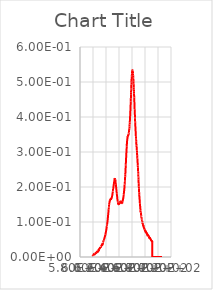
| Category | Series 0 |
|---|---|
| 599.2322998 | 0.005 |
| 599.3508301 | 0.005 |
| 599.4693604 | 0.006 |
| 599.5878906 | 0.005 |
| 599.7064209 | 0.006 |
| 599.8248901 | 0.005 |
| 599.9434204 | 0.006 |
| 600.0619507 | 0.005 |
| 600.180481 | 0.006 |
| 600.2990112 | 0.006 |
| 600.4175415 | 0.006 |
| 600.5361328 | 0.006 |
| 600.6546631 | 0.007 |
| 600.7731934 | 0.006 |
| 600.8917236 | 0.007 |
| 601.0102539 | 0.007 |
| 601.1288452 | 0.008 |
| 601.2473755 | 0.006 |
| 601.3659058 | 0.008 |
| 601.4844971 | 0.007 |
| 601.6030273 | 0.009 |
| 601.7215576 | 0.007 |
| 601.8401489 | 0.008 |
| 601.9586792 | 0.008 |
| 602.0772705 | 0.009 |
| 602.1958008 | 0.008 |
| 602.3143921 | 0.009 |
| 602.4329834 | 0.008 |
| 602.5515137 | 0.007 |
| 602.670105 | 0.008 |
| 602.7886963 | 0.01 |
| 602.9072876 | 0.009 |
| 603.0258179 | 0.01 |
| 603.1444092 | 0.009 |
| 603.2630005 | 0.01 |
| 603.3815918 | 0.009 |
| 603.5001831 | 0.01 |
| 603.6187744 | 0.01 |
| 603.7373657 | 0.01 |
| 603.855957 | 0.01 |
| 603.9745483 | 0.011 |
| 604.0931396 | 0.011 |
| 604.211731 | 0.011 |
| 604.3303833 | 0.01 |
| 604.4489746 | 0.012 |
| 604.5675659 | 0.011 |
| 604.6861572 | 0.012 |
| 604.8048096 | 0.012 |
| 604.9234009 | 0.013 |
| 605.0419922 | 0.012 |
| 605.1606445 | 0.013 |
| 605.2792358 | 0.012 |
| 605.3978882 | 0.013 |
| 605.5164795 | 0.013 |
| 605.6351318 | 0.014 |
| 605.7537231 | 0.013 |
| 605.8723755 | 0.015 |
| 605.9910278 | 0.014 |
| 606.1096191 | 0.015 |
| 606.2282715 | 0.014 |
| 606.3469238 | 0.015 |
| 606.4655762 | 0.015 |
| 606.5841675 | 0.015 |
| 606.7028198 | 0.015 |
| 606.8214722 | 0.016 |
| 606.9401245 | 0.016 |
| 607.0587769 | 0.017 |
| 607.1774292 | 0.013 |
| 607.2960815 | 0.018 |
| 607.4147339 | 0.017 |
| 607.5333862 | 0.017 |
| 607.6520386 | 0.017 |
| 607.7706909 | 0.018 |
| 607.8893433 | 0.018 |
| 608.0080566 | 0.019 |
| 608.126709 | 0.018 |
| 608.2453613 | 0.02 |
| 608.3640137 | 0.019 |
| 608.4827271 | 0.02 |
| 608.6013794 | 0.019 |
| 608.7200317 | 0.02 |
| 608.8387451 | 0.018 |
| 608.9573975 | 0.019 |
| 609.0761108 | 0.019 |
| 609.1947632 | 0.02 |
| 609.3134766 | 0.022 |
| 609.4321289 | 0.022 |
| 609.5508423 | 0.024 |
| 609.6695557 | 0.023 |
| 609.788208 | 0.024 |
| 609.9069214 | 0.023 |
| 610.0256348 | 0.024 |
| 610.1443481 | 0.024 |
| 610.2630005 | 0.025 |
| 610.3817139 | 0.025 |
| 610.5004272 | 0.026 |
| 610.6191406 | 0.025 |
| 610.737854 | 0.026 |
| 610.8565674 | 0.026 |
| 610.9752808 | 0.027 |
| 611.0939941 | 0.027 |
| 611.2127075 | 0.028 |
| 611.3314209 | 0.027 |
| 611.4501343 | 0.029 |
| 611.5688477 | 0.028 |
| 611.687561 | 0.029 |
| 611.8063354 | 0.029 |
| 611.9250488 | 0.03 |
| 612.0437622 | 0.03 |
| 612.1624756 | 0.029 |
| 612.28125 | 0.029 |
| 612.3999634 | 0.031 |
| 612.5187378 | 0.031 |
| 612.6374512 | 0.031 |
| 612.7561646 | 0.031 |
| 612.874939 | 0.032 |
| 612.9936523 | 0.032 |
| 613.1124268 | 0.033 |
| 613.2312012 | 0.032 |
| 613.3499146 | 0.033 |
| 613.468689 | 0.033 |
| 613.5874023 | 0.034 |
| 613.7061768 | 0.034 |
| 613.8249512 | 0.034 |
| 613.9437256 | 0.035 |
| 614.062439 | 0.036 |
| 614.1812134 | 0.036 |
| 614.2999878 | 0.037 |
| 614.4187622 | 0.034 |
| 614.5375366 | 0.038 |
| 614.656311 | 0.038 |
| 614.7750854 | 0.039 |
| 614.8938599 | 0.038 |
| 615.0126343 | 0.04 |
| 615.1314087 | 0.04 |
| 615.2501831 | 0.041 |
| 615.3689575 | 0.041 |
| 615.4877319 | 0.043 |
| 615.6065063 | 0.042 |
| 615.7253418 | 0.043 |
| 615.8441162 | 0.043 |
| 615.9628906 | 0.045 |
| 616.081665 | 0.045 |
| 616.2005005 | 0.046 |
| 616.3192749 | 0.046 |
| 616.4380493 | 0.047 |
| 616.5568848 | 0.047 |
| 616.6756592 | 0.048 |
| 616.7944946 | 0.047 |
| 616.913269 | 0.05 |
| 617.0321045 | 0.05 |
| 617.1508789 | 0.052 |
| 617.2697144 | 0.052 |
| 617.3885498 | 0.053 |
| 617.5073242 | 0.053 |
| 617.6261597 | 0.054 |
| 617.7449951 | 0.054 |
| 617.8637695 | 0.056 |
| 617.982605 | 0.056 |
| 618.1014404 | 0.057 |
| 618.2202759 | 0.057 |
| 618.3391113 | 0.059 |
| 618.4579468 | 0.059 |
| 618.5767212 | 0.061 |
| 618.6955566 | 0.061 |
| 618.8143921 | 0.063 |
| 618.9332275 | 0.062 |
| 619.052063 | 0.064 |
| 619.1708984 | 0.065 |
| 619.2897339 | 0.066 |
| 619.4086304 | 0.067 |
| 619.5274658 | 0.068 |
| 619.6463013 | 0.069 |
| 619.7651367 | 0.07 |
| 619.8839722 | 0.071 |
| 620.0028687 | 0.074 |
| 620.1217041 | 0.074 |
| 620.2405396 | 0.076 |
| 620.359436 | 0.076 |
| 620.4782715 | 0.078 |
| 620.5971069 | 0.079 |
| 620.7160034 | 0.081 |
| 620.8348389 | 0.081 |
| 620.9537354 | 0.084 |
| 621.0725708 | 0.085 |
| 621.1914673 | 0.087 |
| 621.3103027 | 0.087 |
| 621.4291992 | 0.091 |
| 621.5480347 | 0.091 |
| 621.6669312 | 0.094 |
| 621.7858276 | 0.094 |
| 621.9047241 | 0.096 |
| 622.0235596 | 0.097 |
| 622.1424561 | 0.1 |
| 622.2613525 | 0.102 |
| 622.380249 | 0.104 |
| 622.4990845 | 0.105 |
| 622.617981 | 0.109 |
| 622.7368774 | 0.11 |
| 622.8557739 | 0.112 |
| 622.9746704 | 0.114 |
| 623.0935669 | 0.117 |
| 623.2124634 | 0.118 |
| 623.3313599 | 0.121 |
| 623.4502563 | 0.123 |
| 623.5691528 | 0.126 |
| 623.6880493 | 0.127 |
| 623.8070068 | 0.131 |
| 623.9259033 | 0.133 |
| 624.0447998 | 0.136 |
| 624.1636963 | 0.136 |
| 624.2825928 | 0.141 |
| 624.4015503 | 0.142 |
| 624.5204468 | 0.145 |
| 624.6393433 | 0.146 |
| 624.7583008 | 0.149 |
| 624.8771973 | 0.15 |
| 624.9960938 | 0.152 |
| 625.1150513 | 0.153 |
| 625.2339478 | 0.155 |
| 625.3529053 | 0.156 |
| 625.4718018 | 0.157 |
| 625.5907593 | 0.158 |
| 625.7097168 | 0.161 |
| 625.8286133 | 0.16 |
| 625.9475708 | 0.161 |
| 626.0664673 | 0.162 |
| 626.1854248 | 0.163 |
| 626.3043823 | 0.162 |
| 626.4233398 | 0.164 |
| 626.5422363 | 0.163 |
| 626.6611938 | 0.164 |
| 626.7801514 | 0.165 |
| 626.8991089 | 0.166 |
| 627.0180664 | 0.165 |
| 627.1370239 | 0.166 |
| 627.2559204 | 0.165 |
| 627.3748779 | 0.166 |
| 627.4938354 | 0.165 |
| 627.612793 | 0.167 |
| 627.7317505 | 0.163 |
| 627.850708 | 0.167 |
| 627.9697266 | 0.166 |
| 628.0886841 | 0.167 |
| 628.2076416 | 0.167 |
| 628.3265991 | 0.168 |
| 628.4455566 | 0.168 |
| 628.5645142 | 0.169 |
| 628.6835327 | 0.169 |
| 628.8024902 | 0.17 |
| 628.9214478 | 0.17 |
| 629.0404053 | 0.171 |
| 629.1594238 | 0.172 |
| 629.2783813 | 0.173 |
| 629.3973389 | 0.174 |
| 629.5163574 | 0.176 |
| 629.6353149 | 0.176 |
| 629.7543335 | 0.178 |
| 629.873291 | 0.179 |
| 629.9923096 | 0.181 |
| 630.1112671 | 0.182 |
| 630.2302856 | 0.184 |
| 630.3492432 | 0.185 |
| 630.4682617 | 0.187 |
| 630.5872803 | 0.188 |
| 630.7062378 | 0.19 |
| 630.8252563 | 0.19 |
| 630.9442749 | 0.194 |
| 631.0632324 | 0.195 |
| 631.182251 | 0.197 |
| 631.3012695 | 0.198 |
| 631.4202881 | 0.199 |
| 631.5393066 | 0.201 |
| 631.6583252 | 0.204 |
| 631.7772827 | 0.204 |
| 631.8963013 | 0.206 |
| 632.0153198 | 0.208 |
| 632.1343384 | 0.209 |
| 632.2533569 | 0.211 |
| 632.3723755 | 0.213 |
| 632.491394 | 0.214 |
| 632.6104126 | 0.216 |
| 632.7294312 | 0.216 |
| 632.8485107 | 0.218 |
| 632.9675293 | 0.219 |
| 633.0865479 | 0.222 |
| 633.2055664 | 0.223 |
| 633.324585 | 0.224 |
| 633.4436035 | 0.223 |
| 633.5626831 | 0.224 |
| 633.6817017 | 0.223 |
| 633.8007202 | 0.223 |
| 633.9197998 | 0.223 |
| 634.0388184 | 0.222 |
| 634.1578369 | 0.22 |
| 634.2769165 | 0.221 |
| 634.3959351 | 0.219 |
| 634.5150146 | 0.219 |
| 634.6340332 | 0.216 |
| 634.7531128 | 0.215 |
| 634.8721313 | 0.213 |
| 634.9912109 | 0.212 |
| 635.1102295 | 0.208 |
| 635.2293091 | 0.206 |
| 635.3483276 | 0.204 |
| 635.4674072 | 0.203 |
| 635.5864868 | 0.199 |
| 635.7055054 | 0.198 |
| 635.824585 | 0.195 |
| 635.9436646 | 0.193 |
| 636.0627441 | 0.191 |
| 636.1817627 | 0.189 |
| 636.3008423 | 0.186 |
| 636.4199219 | 0.184 |
| 636.5390015 | 0.181 |
| 636.6580811 | 0.18 |
| 636.7771606 | 0.178 |
| 636.8961792 | 0.176 |
| 637.0152588 | 0.174 |
| 637.1343384 | 0.173 |
| 637.253418 | 0.17 |
| 637.3724976 | 0.169 |
| 637.4915771 | 0.166 |
| 637.6106567 | 0.165 |
| 637.7297974 | 0.162 |
| 637.848877 | 0.162 |
| 637.9679565 | 0.159 |
| 638.0870361 | 0.159 |
| 638.2061157 | 0.157 |
| 638.3251953 | 0.156 |
| 638.4442749 | 0.154 |
| 638.5634155 | 0.154 |
| 638.6824951 | 0.153 |
| 638.8015747 | 0.154 |
| 638.9207153 | 0.152 |
| 639.0397949 | 0.152 |
| 639.1588745 | 0.151 |
| 639.2780151 | 0.152 |
| 639.3970947 | 0.15 |
| 639.5161743 | 0.151 |
| 639.6353149 | 0.152 |
| 639.7543945 | 0.152 |
| 639.8735352 | 0.153 |
| 639.9926147 | 0.153 |
| 640.1117554 | 0.154 |
| 640.230835 | 0.153 |
| 640.3499756 | 0.152 |
| 640.4691162 | 0.152 |
| 640.5881958 | 0.154 |
| 640.7073364 | 0.153 |
| 640.8264771 | 0.154 |
| 640.9455566 | 0.154 |
| 641.0646973 | 0.155 |
| 641.1838379 | 0.155 |
| 641.3029175 | 0.156 |
| 641.4220581 | 0.157 |
| 641.5411987 | 0.158 |
| 641.6603394 | 0.157 |
| 641.77948 | 0.158 |
| 641.8985596 | 0.157 |
| 642.0177002 | 0.158 |
| 642.1368408 | 0.158 |
| 642.2559814 | 0.158 |
| 642.3751221 | 0.158 |
| 642.4942627 | 0.159 |
| 642.6134033 | 0.158 |
| 642.7325439 | 0.158 |
| 642.8516846 | 0.157 |
| 642.9708252 | 0.158 |
| 643.0899658 | 0.157 |
| 643.2091064 | 0.157 |
| 643.3282471 | 0.157 |
| 643.4474487 | 0.157 |
| 643.5665894 | 0.156 |
| 643.68573 | 0.156 |
| 643.8048706 | 0.155 |
| 643.9240112 | 0.156 |
| 644.0432129 | 0.155 |
| 644.1623535 | 0.157 |
| 644.2814941 | 0.156 |
| 644.4006348 | 0.156 |
| 644.5198364 | 0.154 |
| 644.6389771 | 0.155 |
| 644.7581177 | 0.154 |
| 644.8773193 | 0.154 |
| 644.99646 | 0.153 |
| 645.1156616 | 0.156 |
| 645.2348022 | 0.156 |
| 645.3540039 | 0.159 |
| 645.4731445 | 0.159 |
| 645.5923462 | 0.161 |
| 645.7114868 | 0.161 |
| 645.8306885 | 0.163 |
| 645.9498291 | 0.162 |
| 646.0690308 | 0.164 |
| 646.1881714 | 0.164 |
| 646.307373 | 0.166 |
| 646.4265747 | 0.166 |
| 646.5457153 | 0.169 |
| 646.664917 | 0.169 |
| 646.7841187 | 0.171 |
| 646.9033203 | 0.172 |
| 647.0224609 | 0.174 |
| 647.1416626 | 0.176 |
| 647.2608643 | 0.179 |
| 647.3800659 | 0.18 |
| 647.4992065 | 0.182 |
| 647.6184082 | 0.184 |
| 647.7376099 | 0.187 |
| 647.8568115 | 0.188 |
| 647.9760132 | 0.191 |
| 648.0952148 | 0.193 |
| 648.2144165 | 0.196 |
| 648.3336182 | 0.197 |
| 648.4528198 | 0.201 |
| 648.5720215 | 0.203 |
| 648.6912231 | 0.207 |
| 648.8104248 | 0.209 |
| 648.9296265 | 0.213 |
| 649.0488281 | 0.215 |
| 649.1680298 | 0.219 |
| 649.2872314 | 0.223 |
| 649.4064331 | 0.227 |
| 649.5256958 | 0.23 |
| 649.6448975 | 0.235 |
| 649.7640991 | 0.238 |
| 649.8833008 | 0.242 |
| 650.0025024 | 0.246 |
| 650.1217651 | 0.252 |
| 650.2409668 | 0.256 |
| 650.3601685 | 0.262 |
| 650.4794312 | 0.265 |
| 650.5986328 | 0.27 |
| 650.7178345 | 0.274 |
| 650.8370972 | 0.279 |
| 650.9562988 | 0.283 |
| 651.0755615 | 0.289 |
| 651.1947632 | 0.292 |
| 651.3139648 | 0.296 |
| 651.4332275 | 0.3 |
| 651.5524292 | 0.304 |
| 651.6716919 | 0.307 |
| 651.7908936 | 0.312 |
| 651.9101563 | 0.315 |
| 652.0293579 | 0.323 |
| 652.1486206 | 0.322 |
| 652.2678833 | 0.326 |
| 652.387085 | 0.328 |
| 652.5063477 | 0.332 |
| 652.6256104 | 0.333 |
| 652.744812 | 0.336 |
| 652.8640747 | 0.338 |
| 652.9833374 | 0.339 |
| 653.1025391 | 0.341 |
| 653.2218018 | 0.344 |
| 653.3410645 | 0.343 |
| 653.4603271 | 0.345 |
| 653.5795288 | 0.346 |
| 653.6987915 | 0.347 |
| 653.8180542 | 0.347 |
| 653.9373169 | 0.348 |
| 654.0565796 | 0.348 |
| 654.1758423 | 0.349 |
| 654.295105 | 0.348 |
| 654.4143677 | 0.35 |
| 654.5335693 | 0.35 |
| 654.652832 | 0.351 |
| 654.7720947 | 0.351 |
| 654.8913574 | 0.353 |
| 655.0106201 | 0.355 |
| 655.1298828 | 0.356 |
| 655.2492065 | 0.356 |
| 655.3684692 | 0.36 |
| 655.4877319 | 0.359 |
| 655.6069946 | 0.363 |
| 655.7262573 | 0.363 |
| 655.84552 | 0.367 |
| 655.9647827 | 0.368 |
| 656.0840454 | 0.372 |
| 656.2033691 | 0.374 |
| 656.3226318 | 0.378 |
| 656.4418945 | 0.38 |
| 656.5611572 | 0.384 |
| 656.6804199 | 0.387 |
| 656.7997437 | 0.391 |
| 656.9190063 | 0.394 |
| 657.038269 | 0.4 |
| 657.1575928 | 0.403 |
| 657.2768555 | 0.409 |
| 657.3961182 | 0.413 |
| 657.5154419 | 0.418 |
| 657.6347046 | 0.423 |
| 657.7539673 | 0.429 |
| 657.873291 | 0.434 |
| 657.9925537 | 0.44 |
| 658.1118774 | 0.445 |
| 658.2311401 | 0.452 |
| 658.3504639 | 0.457 |
| 658.4697266 | 0.465 |
| 658.5890503 | 0.47 |
| 658.708313 | 0.478 |
| 658.8276367 | 0.481 |
| 658.9468994 | 0.489 |
| 659.0662231 | 0.493 |
| 659.1855469 | 0.499 |
| 659.3048096 | 0.502 |
| 659.4241333 | 0.509 |
| 659.543457 | 0.511 |
| 659.6627197 | 0.517 |
| 659.7820435 | 0.519 |
| 659.9013672 | 0.524 |
| 660.0206299 | 0.525 |
| 660.1399536 | 0.528 |
| 660.2592773 | 0.53 |
| 660.3786011 | 0.533 |
| 660.4978638 | 0.534 |
| 660.6171875 | 0.534 |
| 660.7365112 | 0.533 |
| 660.855835 | 0.534 |
| 660.9751587 | 0.532 |
| 661.0944214 | 0.532 |
| 661.2137451 | 0.529 |
| 661.3330688 | 0.529 |
| 661.4523926 | 0.525 |
| 661.5717163 | 0.525 |
| 661.69104 | 0.52 |
| 661.8103638 | 0.519 |
| 661.9296875 | 0.513 |
| 662.0490112 | 0.511 |
| 662.168335 | 0.505 |
| 662.2876587 | 0.502 |
| 662.4069824 | 0.496 |
| 662.5263062 | 0.493 |
| 662.6456299 | 0.488 |
| 662.7649536 | 0.484 |
| 662.8842773 | 0.478 |
| 663.0036011 | 0.474 |
| 663.1229248 | 0.467 |
| 663.2423096 | 0.463 |
| 663.3616333 | 0.456 |
| 663.480957 | 0.45 |
| 663.6002808 | 0.445 |
| 663.7196045 | 0.44 |
| 663.8389282 | 0.433 |
| 663.958313 | 0.428 |
| 664.0776367 | 0.421 |
| 664.1969604 | 0.417 |
| 664.3162842 | 0.411 |
| 664.4356689 | 0.406 |
| 664.5549927 | 0.399 |
| 664.6743164 | 0.395 |
| 664.7937012 | 0.388 |
| 664.9130249 | 0.384 |
| 665.0323486 | 0.38 |
| 665.1517334 | 0.375 |
| 665.2710571 | 0.369 |
| 665.3903809 | 0.365 |
| 665.5097656 | 0.361 |
| 665.6290894 | 0.358 |
| 665.7484741 | 0.353 |
| 665.8677979 | 0.35 |
| 665.9871826 | 0.345 |
| 666.1065063 | 0.343 |
| 666.2258911 | 0.338 |
| 666.3452148 | 0.335 |
| 666.4645996 | 0.329 |
| 666.5839233 | 0.326 |
| 666.7033081 | 0.322 |
| 666.8226318 | 0.323 |
| 666.9420166 | 0.318 |
| 667.0614014 | 0.316 |
| 667.1807251 | 0.312 |
| 667.3001099 | 0.309 |
| 667.4194336 | 0.304 |
| 667.5388184 | 0.303 |
| 667.6582031 | 0.299 |
| 667.7775269 | 0.296 |
| 667.8969116 | 0.292 |
| 668.0162964 | 0.289 |
| 668.1356812 | 0.283 |
| 668.2550049 | 0.282 |
| 668.3743896 | 0.277 |
| 668.4937744 | 0.274 |
| 668.6131592 | 0.271 |
| 668.7324829 | 0.267 |
| 668.8518677 | 0.262 |
| 668.9712524 | 0.261 |
| 669.0906372 | 0.256 |
| 669.210022 | 0.252 |
| 669.3293457 | 0.248 |
| 669.4487305 | 0.244 |
| 669.5681152 | 0.238 |
| 669.6875 | 0.236 |
| 669.8068848 | 0.23 |
| 669.9262695 | 0.227 |
| 670.0456543 | 0.222 |
| 670.1650391 | 0.214 |
| 670.2844238 | 0.209 |
| 670.4038086 | 0.204 |
| 670.5231934 | 0.201 |
| 670.6425781 | 0.196 |
| 670.7619629 | 0.192 |
| 670.8813477 | 0.188 |
| 671.0007324 | 0.185 |
| 671.1201172 | 0.18 |
| 671.239502 | 0.178 |
| 671.3588867 | 0.173 |
| 671.4782715 | 0.171 |
| 671.5976563 | 0.167 |
| 671.717041 | 0.165 |
| 671.8364258 | 0.161 |
| 671.9558105 | 0.159 |
| 672.0752563 | 0.154 |
| 672.1946411 | 0.153 |
| 672.3140259 | 0.149 |
| 672.4334106 | 0.148 |
| 672.5527954 | 0.144 |
| 672.6721802 | 0.142 |
| 672.791626 | 0.139 |
| 672.9110107 | 0.137 |
| 673.0303955 | 0.134 |
| 673.1497803 | 0.134 |
| 673.2692261 | 0.128 |
| 673.3886108 | 0.129 |
| 673.5079956 | 0.127 |
| 673.6274414 | 0.126 |
| 673.7468262 | 0.124 |
| 673.8662109 | 0.123 |
| 673.9856567 | 0.121 |
| 674.1050415 | 0.12 |
| 674.2244263 | 0.118 |
| 674.3438721 | 0.117 |
| 674.4632568 | 0.115 |
| 674.5826416 | 0.115 |
| 674.7020874 | 0.112 |
| 674.8214722 | 0.112 |
| 674.940918 | 0.11 |
| 675.0603027 | 0.11 |
| 675.1796875 | 0.107 |
| 675.2991333 | 0.107 |
| 675.4185181 | 0.105 |
| 675.5379639 | 0.105 |
| 675.6573486 | 0.102 |
| 675.7767944 | 0.102 |
| 675.8961792 | 0.1 |
| 676.015625 | 0.1 |
| 676.1350098 | 0.098 |
| 676.2544556 | 0.098 |
| 676.3739014 | 0.095 |
| 676.4932861 | 0.096 |
| 676.6127319 | 0.094 |
| 676.7321167 | 0.094 |
| 676.8515625 | 0.092 |
| 676.9710083 | 0.093 |
| 677.0903931 | 0.09 |
| 677.2098389 | 0.091 |
| 677.3292236 | 0.088 |
| 677.4486694 | 0.089 |
| 677.5681152 | 0.088 |
| 677.6875 | 0.089 |
| 677.8069458 | 0.086 |
| 677.9263916 | 0.087 |
| 678.0458374 | 0.085 |
| 678.1652222 | 0.085 |
| 678.284668 | 0.083 |
| 678.4041138 | 0.084 |
| 678.5235596 | 0.083 |
| 678.6429443 | 0.083 |
| 678.7623901 | 0.081 |
| 678.8818359 | 0.081 |
| 679.0012817 | 0.08 |
| 679.1206665 | 0.081 |
| 679.2401123 | 0.079 |
| 679.3595581 | 0.079 |
| 679.4790039 | 0.079 |
| 679.5984497 | 0.078 |
| 679.7178955 | 0.077 |
| 679.8372803 | 0.078 |
| 679.9567261 | 0.076 |
| 680.0761719 | 0.077 |
| 680.1956177 | 0.075 |
| 680.3150635 | 0.076 |
| 680.4345093 | 0.075 |
| 680.5539551 | 0.075 |
| 680.6734009 | 0.073 |
| 680.7928467 | 0.074 |
| 680.9122925 | 0.072 |
| 681.0317383 | 0.073 |
| 681.1511841 | 0.07 |
| 681.2706299 | 0.072 |
| 681.3900757 | 0.07 |
| 681.5095215 | 0.072 |
| 681.6289673 | 0.07 |
| 681.7484131 | 0.071 |
| 681.8678589 | 0.069 |
| 681.9873047 | 0.07 |
| 682.1067505 | 0.068 |
| 682.2261963 | 0.07 |
| 682.3456421 | 0.068 |
| 682.4650879 | 0.069 |
| 682.5845337 | 0.067 |
| 682.7039795 | 0.068 |
| 682.8234253 | 0.068 |
| 682.9428711 | 0.067 |
| 683.0623169 | 0.066 |
| 683.1817627 | 0.067 |
| 683.3012695 | 0.065 |
| 683.4207153 | 0.067 |
| 683.5401611 | 0.064 |
| 683.6596069 | 0.065 |
| 683.7790527 | 0.063 |
| 683.8984985 | 0.064 |
| 684.0180054 | 0.062 |
| 684.1374512 | 0.064 |
| 684.256897 | 0.059 |
| 684.3763428 | 0.064 |
| 684.4957886 | 0.061 |
| 684.6152954 | 0.063 |
| 684.7347412 | 0.061 |
| 684.854187 | 0.062 |
| 684.9736328 | 0.06 |
| 685.0931396 | 0.061 |
| 685.2125854 | 0.06 |
| 685.3320313 | 0.061 |
| 685.4514771 | 0.059 |
| 685.5709839 | 0.06 |
| 685.6904297 | 0.059 |
| 685.8098755 | 0.059 |
| 685.9293823 | 0.058 |
| 686.0488281 | 0.058 |
| 686.1682739 | 0.057 |
| 686.2877808 | 0.058 |
| 686.4072266 | 0.056 |
| 686.5266724 | 0.057 |
| 686.6461792 | 0.055 |
| 686.765625 | 0.056 |
| 686.8851318 | 0.053 |
| 687.0045776 | 0.056 |
| 687.1240234 | 0.053 |
| 687.2435303 | 0.055 |
| 687.3629761 | 0.054 |
| 687.4824829 | 0.054 |
| 687.6019287 | 0.052 |
| 687.7213745 | 0.054 |
| 687.8408813 | 0.052 |
| 687.9603271 | 0.053 |
| 688.079834 | 0.052 |
| 688.1992798 | 0.052 |
| 688.3187866 | 0.051 |
| 688.4382324 | 0.052 |
| 688.5577393 | 0.051 |
| 688.6771851 | 0.051 |
| 688.7966919 | 0.05 |
| 688.9161377 | 0.05 |
| 689.0356445 | 0.049 |
| 689.1550903 | 0.05 |
| 689.2745972 | 0.048 |
| 689.394043 | 0.049 |
| 689.5135498 | 0.048 |
| 689.6329956 | 0.048 |
| 689.7525024 | 0.046 |
| 689.8719482 | 0.047 |
| 689.9914551 | 0.047 |
| 690.1109619 | 0.047 |
| 690.2304077 | 0.046 |
| 690.3499146 | 0.046 |
| 690.4693604 | 0.045 |
| 690.5888672 | 0.046 |
| 690.708374 | 0.045 |
| 690.8278198 | 0.044 |
| 690.9473267 | 0.042 |
| 691.0667725 | 0.044 |
| 691.1862793 | 0.042 |
| 691.3057861 | 0 |
| 691.4252319 | 0 |
| 691.5447388 | 0 |
| 691.6642456 | 0 |
| 691.7836914 | 0 |
| 691.9031982 | 0 |
| 692.0227051 | 0 |
| 692.1421509 | 0 |
| 692.2616577 | 0 |
| 692.3811646 | 0 |
| 692.5006104 | 0 |
| 692.6201172 | 0 |
| 692.739624 | 0 |
| 692.8591309 | 0 |
| 692.9785767 | 0 |
| 693.0980835 | 0 |
| 693.2175903 | 0 |
| 693.3370361 | 0 |
| 693.456543 | 0 |
| 693.5760498 | 0 |
| 693.6955566 | 0 |
| 693.8150024 | 0 |
| 693.9345093 | 0 |
| 694.0540161 | 0 |
| 694.1735229 | 0 |
| 694.2930298 | 0 |
| 694.4124756 | 0 |
| 694.5319824 | 0 |
| 694.6514893 | 0 |
| 694.7709961 | 0 |
| 694.8905029 | 0 |
| 695.0099487 | 0 |
| 695.1294556 | 0 |
| 695.2489624 | 0 |
| 695.3684692 | 0 |
| 695.4879761 | 0 |
| 695.6074829 | 0 |
| 695.7269287 | 0 |
| 695.8464355 | 0 |
| 695.9659424 | 0 |
| 696.0854492 | 0 |
| 696.2049561 | 0 |
| 696.3244629 | 0 |
| 696.4439697 | 0 |
| 696.5634155 | 0 |
| 696.6829224 | 0 |
| 696.8024292 | 0 |
| 696.921936 | 0 |
| 697.0414429 | 0 |
| 697.1609497 | 0 |
| 697.2804565 | 0 |
| 697.3999634 | 0 |
| 697.5194702 | 0 |
| 697.6389771 | 0 |
| 697.7584839 | 0 |
| 697.8779297 | 0 |
| 697.9974365 | 0 |
| 698.1169434 | 0 |
| 698.2364502 | 0 |
| 698.355957 | 0 |
| 698.4754639 | 0 |
| 698.5949707 | 0 |
| 698.7144775 | 0 |
| 698.8339844 | 0 |
| 698.9534912 | 0 |
| 699.072998 | 0 |
| 699.1925049 | 0 |
| 699.3120117 | 0 |
| 699.4315186 | 0 |
| 699.5510254 | 0 |
| 699.6705322 | 0 |
| 699.7900391 | 0 |
| 699.9095459 | 0 |
| 700.0290527 | 0 |
| 700.1485596 | 0 |
| 700.2680664 | 0 |
| 700.3875732 | 0 |
| 700.5070801 | 0 |
| 700.6265869 | 0 |
| 700.7460938 | 0 |
| 700.8656006 | 0 |
| 700.9851074 | 0 |
| 701.1046143 | 0 |
| 701.2241211 | 0 |
| 701.3436279 | 0 |
| 701.4631348 | 0 |
| 701.5826416 | 0 |
| 701.7021484 | 0 |
| 701.8216553 | 0 |
| 701.9411621 | 0 |
| 702.0606689 | 0 |
| 702.1801758 | 0 |
| 702.2997437 | 0 |
| 702.4192505 | 0 |
| 702.5387573 | 0 |
| 702.6582642 | 0 |
| 702.777771 | 0 |
| 702.8972778 | 0 |
| 703.0167847 | 0 |
| 703.1362915 | 0 |
| 703.2557983 | 0 |
| 703.3753052 | 0 |
| 703.494812 | 0 |
| 703.6143188 | 0 |
| 703.7338867 | 0 |
| 703.8533936 | 0 |
| 703.9729004 | 0 |
| 704.0924072 | 0 |
| 704.2119141 | 0 |
| 704.3314209 | 0 |
| 704.4509277 | 0 |
| 704.5704346 | 0 |
| 704.6899414 | 0 |
| 704.8094482 | 0 |
| 704.9290161 | 0 |
| 705.0485229 | 0 |
| 705.1680298 | 0 |
| 705.2875366 | 0 |
| 705.4070435 | 0 |
| 705.5265503 | 0 |
| 705.6460571 | 0 |
| 705.765564 | 0 |
| 705.8851318 | 0 |
| 706.0046387 | 0 |
| 706.1241455 | 0 |
| 706.2436523 | 0 |